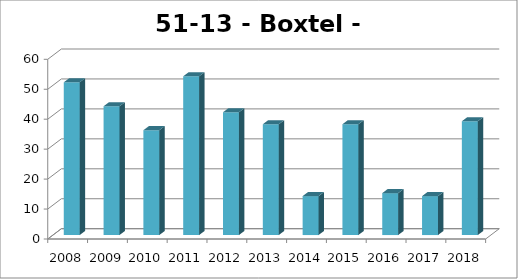
| Category | Boxtel - Lennisheuvel |
|---|---|
| 2008.0 | 51 |
| 2009.0 | 43 |
| 2010.0 | 35 |
| 2011.0 | 53 |
| 2012.0 | 41 |
| 2013.0 | 37 |
| 2014.0 | 13 |
| 2015.0 | 37 |
| 2016.0 | 14 |
| 2017.0 | 13 |
| 2018.0 | 38 |